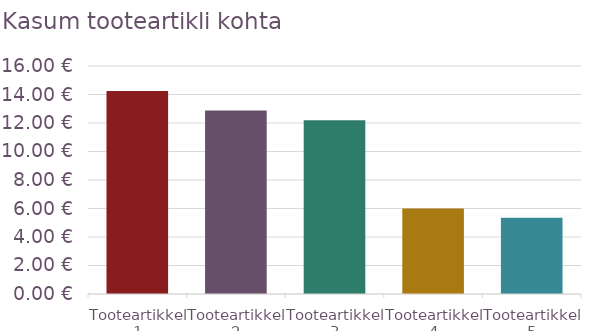
| Category | Kasum tooteartikli kohta 
(sh saatekulud) |
|---|---|
| Tooteartikkel 1 | 14.25 |
| Tooteartikkel 2 | 12.875 |
| Tooteartikkel 3 | 12.2 |
| Tooteartikkel 4 | 6 |
| Tooteartikkel 5 | 5.35 |